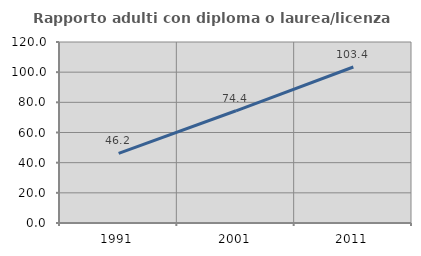
| Category | Rapporto adulti con diploma o laurea/licenza media  |
|---|---|
| 1991.0 | 46.185 |
| 2001.0 | 74.398 |
| 2011.0 | 103.421 |